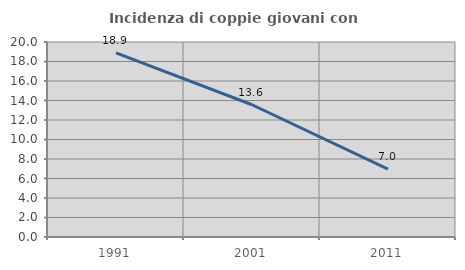
| Category | Incidenza di coppie giovani con figli |
|---|---|
| 1991.0 | 18.888 |
| 2001.0 | 13.563 |
| 2011.0 | 6.952 |